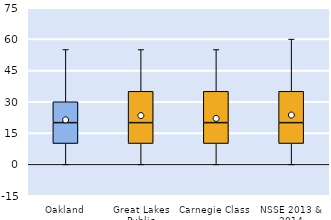
| Category | 25th | 50th | 75th |
|---|---|---|---|
| Oakland | 10 | 10 | 10 |
| Great Lakes Public | 10 | 10 | 15 |
| Carnegie Class | 10 | 10 | 15 |
| NSSE 2013 & 2014 | 10 | 10 | 15 |